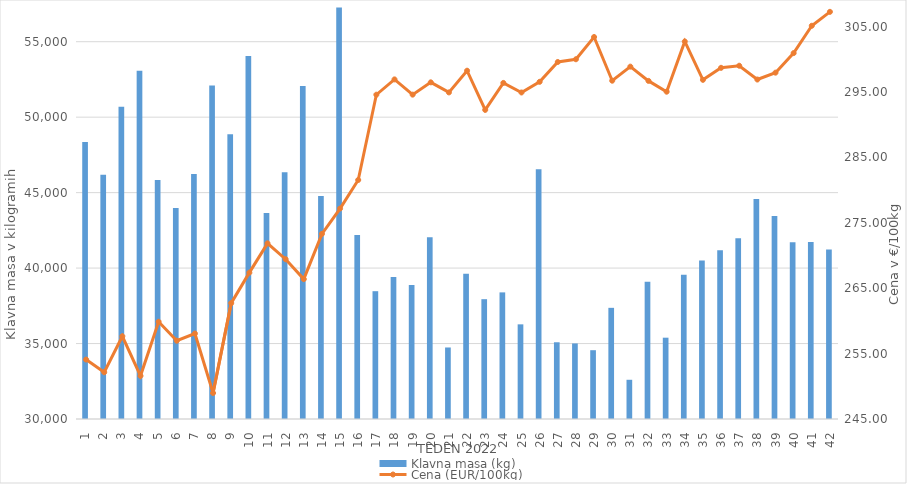
| Category | Klavna masa (kg) |
|---|---|
| 1.0 | 48349 |
| 2.0 | 46187 |
| 3.0 | 50692 |
| 4.0 | 53081 |
| 5.0 | 45844 |
| 6.0 | 43982 |
| 7.0 | 46227 |
| 8.0 | 52099 |
| 9.0 | 48872 |
| 10.0 | 54045 |
| 11.0 | 43645 |
| 12.0 | 46350 |
| 13.0 | 52061 |
| 14.0 | 44774 |
| 15.0 | 57268 |
| 16.0 | 42191 |
| 17.0 | 38469 |
| 18.0 | 39417 |
| 19.0 | 38876 |
| 20.0 | 42047 |
| 21.0 | 34739 |
| 22.0 | 39626 |
| 23.0 | 37939 |
| 24.0 | 38390 |
| 25.0 | 36272 |
| 26.0 | 46553 |
| 27.0 | 35085 |
| 28.0 | 35007 |
| 29.0 | 34559 |
| 30.0 | 37366 |
| 31.0 | 32599 |
| 32.0 | 39100 |
| 33.0 | 35388 |
| 34.0 | 39563 |
| 35.0 | 40507 |
| 36.0 | 41176 |
| 37.0 | 41983 |
| 38.0 | 44572 |
| 39.0 | 43447 |
| 40.0 | 41711 |
| 41.0 | 41736 |
| 42.0 | 41239 |